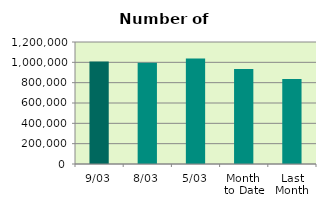
| Category | Series 0 |
|---|---|
| 9/03 | 1008412 |
| 8/03 | 996996 |
| 5/03 | 1036580 |
| Month 
to Date | 933923.429 |
| Last
Month | 836497.7 |